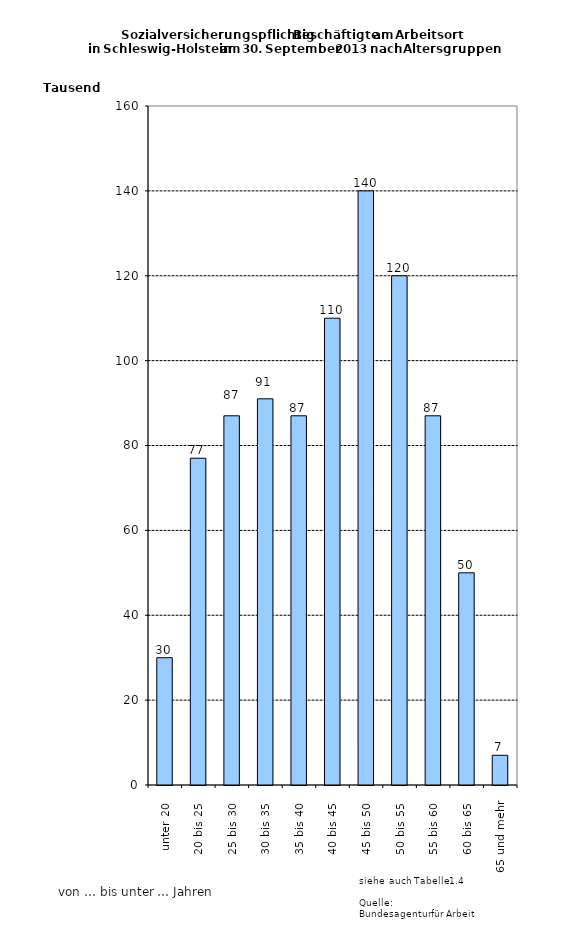
| Category | Series 0 |
|---|---|
| unter 20 | 30000 |
| 20 bis 25 | 77000 |
| 25 bis 30 | 87000 |
| 30 bis 35 | 91000 |
| 35 bis 40 | 87000 |
| 40 bis 45 | 110000 |
| 45 bis 50 | 140000 |
| 50 bis 55 | 120000 |
| 55 bis 60 | 87000 |
| 60 bis 65 | 50000 |
| 65 und mehr | 7000 |